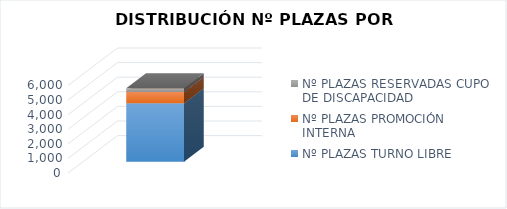
| Category | Nº PLAZAS TURNO LIBRE | Nº PLAZAS PROMOCIÓN INTERNA | Nº PLAZAS RESERVADAS CUPO DE DISCAPACIDAD |
|---|---|---|---|
| 0 | 4006 | 774 | 256 |